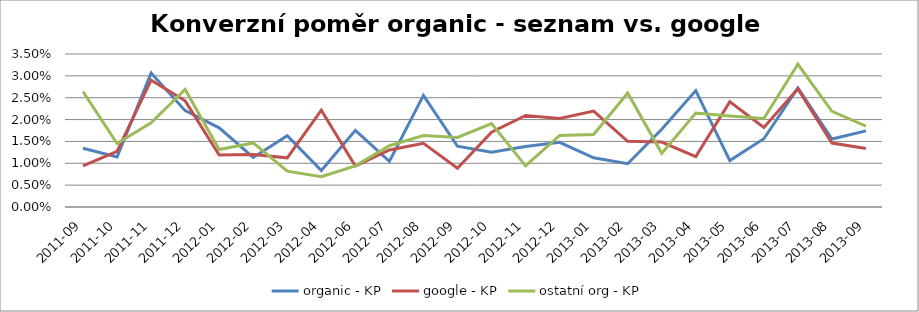
| Category | organic - KP | google - KP | ostatní org - KP |
|---|---|---|---|
| 2011-09 | 0.013 | 0.009 | 0.026 |
| 2011-10 | 0.011 | 0.013 | 0.015 |
| 2011-11 | 0.031 | 0.029 | 0.019 |
| 2011-12 | 0.022 | 0.024 | 0.027 |
| 2012-01 | 0.018 | 0.012 | 0.013 |
| 2012-02 | 0.011 | 0.012 | 0.015 |
| 2012-03 | 0.016 | 0.011 | 0.008 |
| 2012-04 | 0.008 | 0.022 | 0.007 |
| 2012-06 | 0.018 | 0.009 | 0.009 |
| 2012-07 | 0.01 | 0.013 | 0.014 |
| 2012-08 | 0.026 | 0.015 | 0.016 |
| 2012-09 | 0.014 | 0.009 | 0.016 |
| 2012-10 | 0.013 | 0.017 | 0.019 |
| 2012-11 | 0.014 | 0.021 | 0.009 |
| 2012-12 | 0.015 | 0.02 | 0.016 |
| 2013-01 | 0.011 | 0.022 | 0.017 |
| 2013-02 | 0.01 | 0.015 | 0.026 |
| 2013-03 | 0.018 | 0.015 | 0.012 |
| 2013-04 | 0.027 | 0.012 | 0.021 |
| 2013-05 | 0.011 | 0.024 | 0.021 |
| 2013-06 | 0.016 | 0.018 | 0.02 |
| 2013-07 | 0.027 | 0.027 | 0.033 |
| 2013-08 | 0.016 | 0.015 | 0.022 |
| 2013-09 | 0.017 | 0.013 | 0.019 |